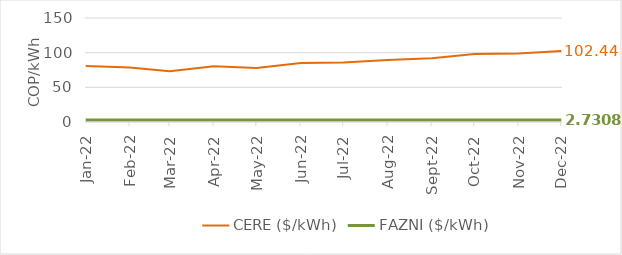
| Category | CERE ($/kWh) | FAZNI ($/kWh) |
|---|---|---|
| 2022-01-01 | 80.844 | 2.731 |
| 2022-02-01 | 78.492 | 2.731 |
| 2022-03-01 | 73.317 | 2.731 |
| 2022-04-01 | 80.502 | 2.731 |
| 2022-05-01 | 77.91 | 2.731 |
| 2022-06-01 | 85.004 | 2.731 |
| 2022-07-01 | 85.711 | 2.731 |
| 2022-08-01 | 89.272 | 2.731 |
| 2022-09-01 | 92.043 | 2.731 |
| 2022-10-01 | 98.055 | 2.731 |
| 2022-11-01 | 98.946 | 2.731 |
| 2022-12-01 | 102.44 | 2.731 |